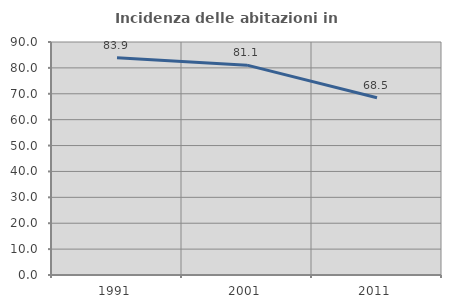
| Category | Incidenza delle abitazioni in proprietà  |
|---|---|
| 1991.0 | 83.871 |
| 2001.0 | 81.051 |
| 2011.0 | 68.459 |